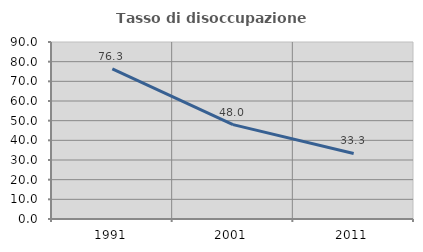
| Category | Tasso di disoccupazione giovanile  |
|---|---|
| 1991.0 | 76.344 |
| 2001.0 | 48 |
| 2011.0 | 33.333 |